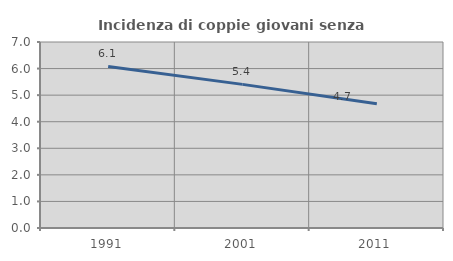
| Category | Incidenza di coppie giovani senza figli |
|---|---|
| 1991.0 | 6.079 |
| 2001.0 | 5.405 |
| 2011.0 | 4.678 |